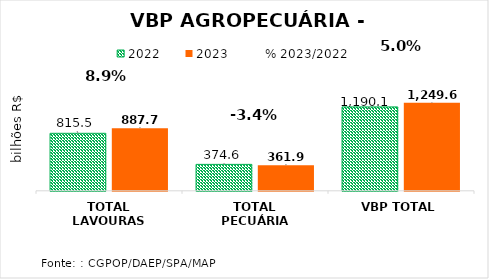
| Category | 2022 | 2023 |
|---|---|---|
| TOTAL LAVOURAS | 815.511 | 887.708 |
| TOTAL PECUÁRIA | 374.613 | 361.939 |
| VBP TOTAL | 1190.125 | 1249.647 |